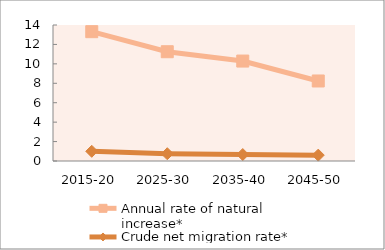
| Category | Annual rate of natural increase* | Crude net migration rate* |
|---|---|---|
| 2015-20 | 13.312 | 0.998 |
| 2025-30 | 11.249 | 0.749 |
| 2035-40 | 10.288 | 0.667 |
| 2045-50 | 8.238 | 0.604 |